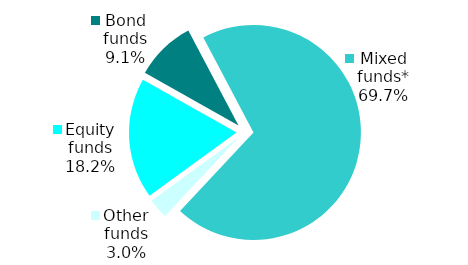
| Category | Series 0 |
|---|---|
| Equity funds | 6 |
| Bond funds | 3 |
| Mixed funds* | 23 |
| Other funds | 1 |